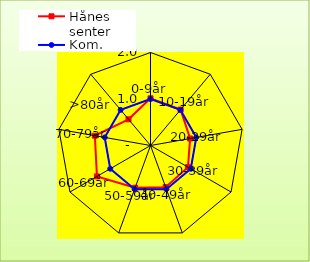
| Category | Hånes senter | Kom. |
|---|---|---|
| 0-9år | 1.015 | 1 |
| 10-19år | 1.007 | 1 |
| 20-29år | 0.865 | 1 |
| 30-39år | 0.93 | 1 |
| 40-49år | 0.953 | 1 |
| 50-59år | 0.966 | 1 |
| 60-69år | 1.33 | 1 |
| 70-79år | 1.215 | 1 |
| >80år | 0.735 | 1 |